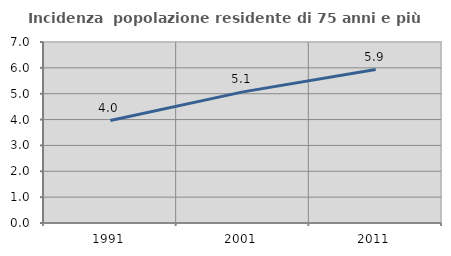
| Category | Incidenza  popolazione residente di 75 anni e più |
|---|---|
| 1991.0 | 3.961 |
| 2001.0 | 5.071 |
| 2011.0 | 5.934 |